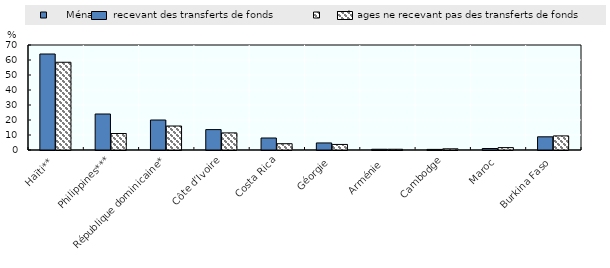
| Category |      Ménages recevant des transferts de fonds |     Ménages ne recevant pas des transferts de fonds |
|---|---|---|
| Haïti** | 64 | 58.5 |
| Philippines*** | 24 | 11 |
| République dominicaine* | 20 | 16 |
| Côte d’Ivoire | 13.6 | 11.4 |
| Costa Rica | 8 | 4.2 |
| Géorgie | 4.7 | 3.7 |
| Arménie  | 0.5 | 0.5 |
| Cambodge | 0.4 | 0.8 |
| Maroc | 1 | 1.6 |
| Burkina Faso | 8.8 | 9.4 |